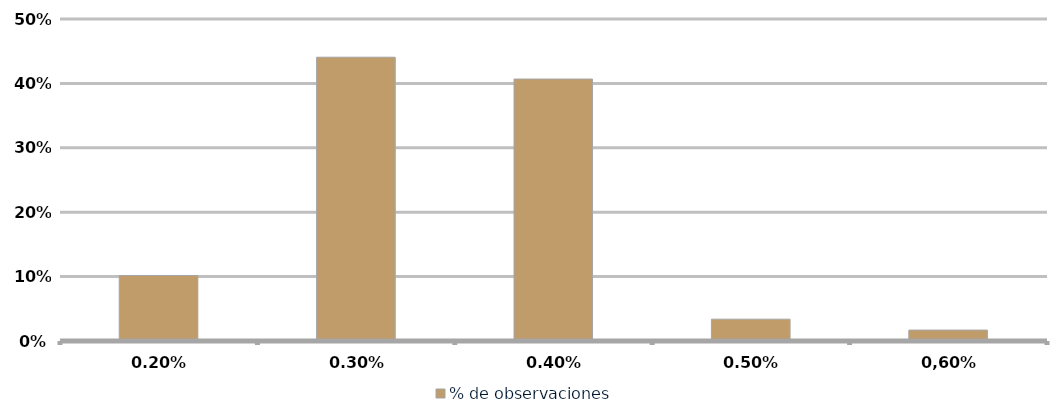
| Category | % de observaciones  |
|---|---|
| 0,20% | 0.102 |
| 0,30% | 0.441 |
| 0,40% | 0.407 |
| 0,50% | 0.034 |
| 0,60% | 0.017 |